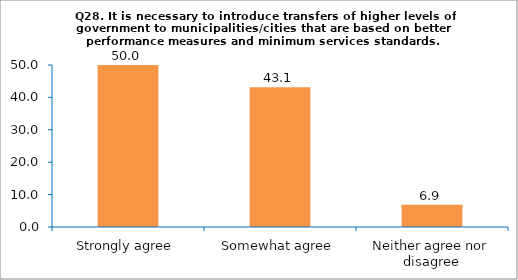
| Category | Series 0 |
|---|---|
| Strongly agree | 50 |
| Somewhat agree | 43.103 |
| Neither agree nor disagree | 6.897 |